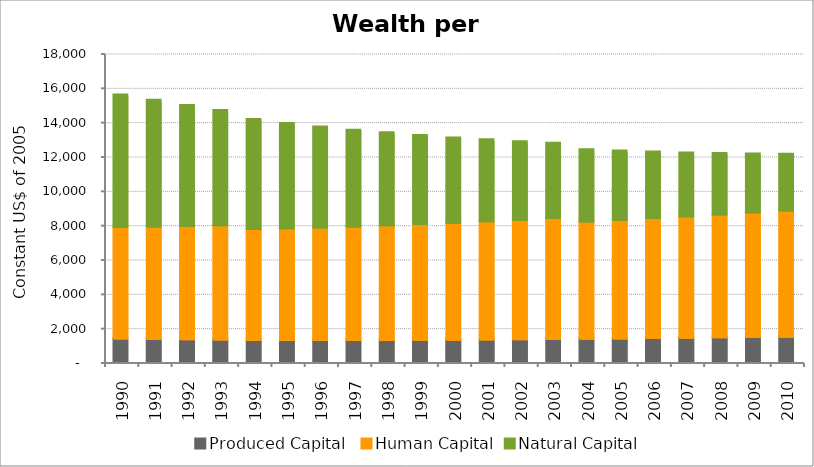
| Category | Produced Capital  | Human Capital | Natural Capital |
|---|---|---|---|
| 1990.0 | 1369.539 | 6495.302 | 7694.222 |
| 1991.0 | 1345.814 | 6544.974 | 7352.165 |
| 1992.0 | 1324.053 | 6600.496 | 7013.385 |
| 1993.0 | 1306.878 | 6662.524 | 6686.869 |
| 1994.0 | 1288.094 | 6453.095 | 6381.597 |
| 1995.0 | 1281.88 | 6514.451 | 6101.146 |
| 1996.0 | 1277.532 | 6563.321 | 5844.916 |
| 1997.0 | 1279.879 | 6619.528 | 5607.726 |
| 1998.0 | 1284.139 | 6680.723 | 5382.896 |
| 1999.0 | 1291.45 | 6743.973 | 5163.26 |
| 2000.0 | 1301.207 | 6806.531 | 4945.112 |
| 2001.0 | 1312.7 | 6880.631 | 4747.61 |
| 2002.0 | 1326.408 | 6957.696 | 4553.09 |
| 2003.0 | 1344.433 | 7037.802 | 4364.041 |
| 2004.0 | 1359.645 | 6826.734 | 4183.198 |
| 2005.0 | 1375.449 | 6905.672 | 4011.946 |
| 2006.0 | 1393.038 | 6988.362 | 3849.33 |
| 2007.0 | 1413.342 | 7072.801 | 3694.929 |
| 2008.0 | 1438.971 | 7159.492 | 3548.352 |
| 2009.0 | 1463.281 | 7249.801 | 3409.129 |
| 2010.0 | 1476.346 | 7343.46 | 3276.777 |